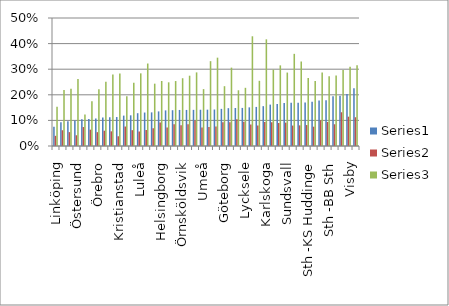
| Category | Series 0 | Series 1 | Series 2 |
|---|---|---|---|
| Linköping | 0.075 | 0.04 | 0.153 |
| Sollefteå | 0.093 | 0.062 | 0.219 |
| Norrköping | 0.097 | 0.054 | 0.223 |
| Östersund | 0.099 | 0.042 | 0.261 |
| Eksjö | 0.105 | 0.074 | 0.123 |
| Borås | 0.106 | 0.064 | 0.175 |
| Örebro | 0.108 | 0.054 | 0.222 |
| Norra Älvsborg | 0.111 | 0.06 | 0.251 |
| Skellefteå | 0.112 | 0.057 | 0.279 |
| Kristianstad | 0.113 | 0.038 | 0.283 |
| Värnamo | 0.119 | 0.076 | 0.194 |
| Karlskrona | 0.12 | 0.062 | 0.247 |
| Luleå | 0.128 | 0.056 | 0.284 |
| Kalmar | 0.131 | 0.062 | 0.322 |
| Lund/Malmö | 0.131 | 0.069 | 0.244 |
| Helsingborg | 0.135 | 0.092 | 0.254 |
| Sth -BB Sophia | 0.139 | 0.073 | 0.249 |
| Nyköping | 0.14 | 0.085 | 0.254 |
| Örnsköldsvik | 0.141 | 0.081 | 0.265 |
| Västerås | 0.141 | 0.085 | 0.275 |
| Ystad | 0.141 | 0.1 | 0.288 |
| Umeå | 0.142 | 0.072 | 0.222 |
| Varberg | 0.142 | 0.074 | 0.331 |
| Skövde | 0.143 | 0.076 | 0.345 |
| Göteborg | 0.145 | 0.093 | 0.234 |
| Västervik | 0.148 | 0.093 | 0.306 |
| Jönköping | 0.148 | 0.104 | 0.218 |
| Lycksele | 0.149 | 0.095 | 0.227 |
| Gällivare | 0.151 | 0.084 | 0.429 |
| Halmstad | 0.153 | 0.08 | 0.255 |
| Karlskoga | 0.156 | 0.094 | 0.417 |
| Falun | 0.162 | 0.092 | 0.298 |
| Eskilstuna | 0.164 | 0.09 | 0.315 |
| Sundsvall | 0.168 | 0.091 | 0.287 |
| Hudiksvall | 0.169 | 0.08 | 0.36 |
| Södertälje | 0.169 | 0.081 | 0.33 |
| Sth -KS Huddinge | 0.17 | 0.082 | 0.265 |
| Sth -Södersjukhuset | 0.173 | 0.075 | 0.254 |
| Uppsala | 0.178 | 0.1 | 0.287 |
| Sth -BB Sth | 0.179 | 0.094 | 0.273 |
| Sth - KS Solna | 0.194 | 0.085 | 0.276 |
| Gävle | 0.196 | 0.132 | 0.297 |
| Visby | 0.203 | 0.115 | 0.31 |
| Sth -Danderyd | 0.226 | 0.112 | 0.316 |